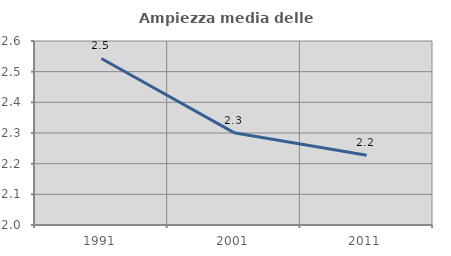
| Category | Ampiezza media delle famiglie |
|---|---|
| 1991.0 | 2.543 |
| 2001.0 | 2.301 |
| 2011.0 | 2.228 |